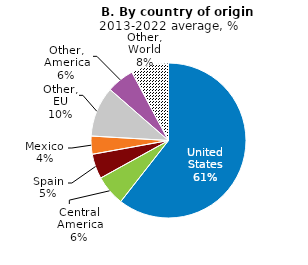
| Category | Series 0 |
|---|---|
| United States | 60.559 |
| Central America | 6.393 |
| Spain | 5.195 |
| Mexico | 3.776 |
| Other, EU | 10.489 |
| Other, America | 5.77 |
| Other, World | 7.818 |